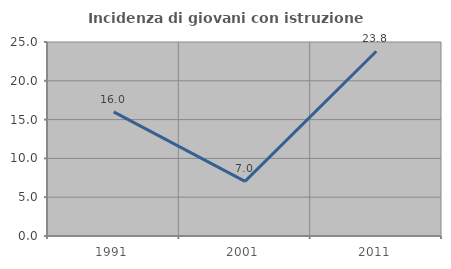
| Category | Incidenza di giovani con istruzione universitaria |
|---|---|
| 1991.0 | 16 |
| 2001.0 | 7.042 |
| 2011.0 | 23.81 |